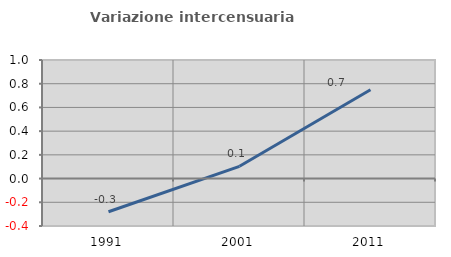
| Category | Variazione intercensuaria annua |
|---|---|
| 1991.0 | -0.28 |
| 2001.0 | 0.104 |
| 2011.0 | 0.75 |